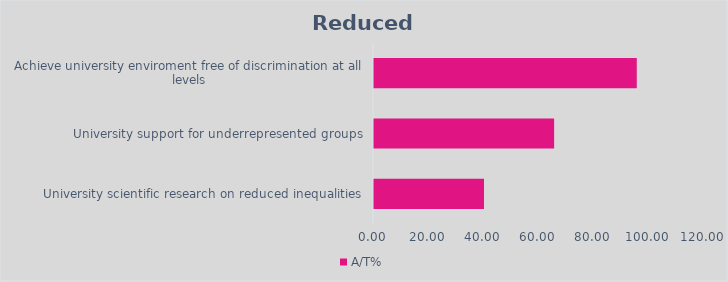
| Category | A/T% |
|---|---|
| University scientific research on reduced inequalities | 40 |
| University support for underrepresented groups | 65.5 |
| Achieve university enviroment free of discrimination at all levels | 95.556 |